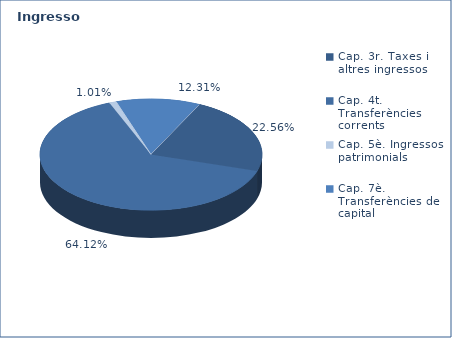
| Category | Series 0 |
|---|---|
| Cap. 3r. Taxes i altres ingressos | 66485406 |
| Cap. 4t. Transferències corrents | 188925612 |
| Cap. 5è. Ingressos patrimonials | 2986500 |
| Cap. 7è. Transferències de capital | 36257428 |
| Cap. 8è. Actius financers | 0 |
| Cap. 9è. Préstecs | 0 |